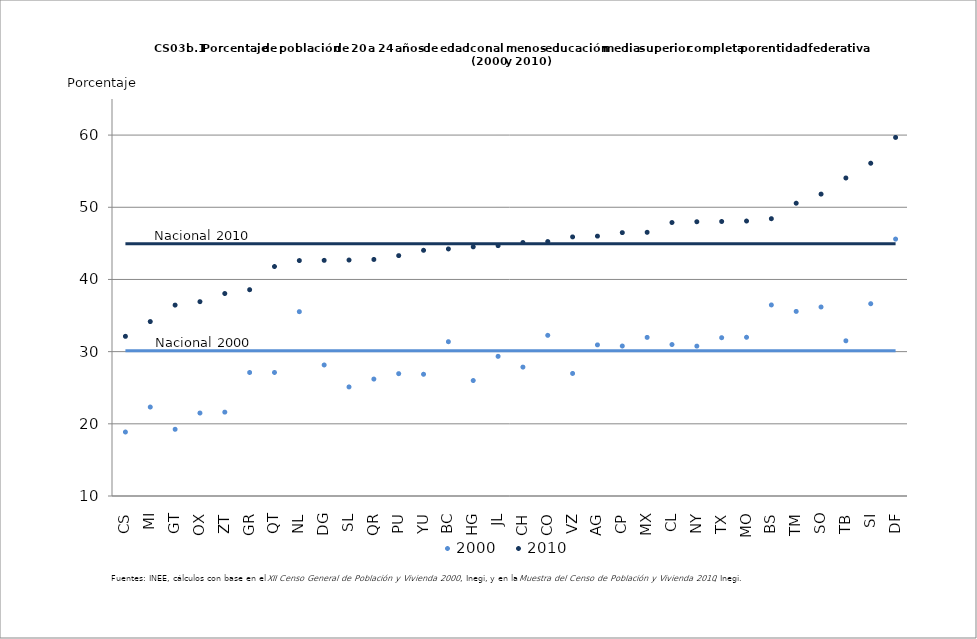
| Category | 2000 | 2010 | nal2000 | nal2010 |
|---|---|---|---|---|
| CS | 18.865 | 32.12 | 30.108 | 44.942 |
| MI | 22.324 | 34.166 | 30.108 | 44.942 |
| GT | 19.243 | 36.45 | 30.108 | 44.942 |
| OX | 21.495 | 36.919 | 30.108 | 44.942 |
| ZT | 21.619 | 38.048 | 30.108 | 44.942 |
| GR | 27.109 | 38.581 | 30.108 | 44.942 |
| QT | 27.115 | 41.792 | 30.108 | 44.942 |
| NL | 35.536 | 42.618 | 30.108 | 44.942 |
| DG | 28.153 | 42.646 | 30.108 | 44.942 |
| SL | 25.109 | 42.691 | 30.108 | 44.942 |
| QR | 26.199 | 42.769 | 30.108 | 44.942 |
| PU | 26.946 | 43.302 | 30.108 | 44.942 |
| YU | 26.865 | 44.038 | 30.108 | 44.942 |
| BC | 31.378 | 44.227 | 30.108 | 44.942 |
| HG | 25.995 | 44.518 | 30.108 | 44.942 |
| JL | 29.349 | 44.682 | 30.108 | 44.942 |
| CH | 27.858 | 45.116 | 30.108 | 44.942 |
| CO | 32.258 | 45.25 | 30.108 | 44.942 |
| VZ | 26.98 | 45.894 | 30.108 | 44.942 |
| AG | 30.938 | 46.002 | 30.108 | 44.942 |
| CP | 30.779 | 46.489 | 30.108 | 44.942 |
| MX | 31.973 | 46.533 | 30.108 | 44.942 |
| CL | 30.986 | 47.89 | 30.108 | 44.942 |
| NY | 30.763 | 47.996 | 30.108 | 44.942 |
| TX | 31.931 | 48.031 | 30.108 | 44.942 |
| MO | 31.992 | 48.096 | 30.108 | 44.942 |
| BS | 36.466 | 48.418 | 30.108 | 44.942 |
| TM | 35.574 | 50.562 | 30.108 | 44.942 |
| SO | 36.185 | 51.824 | 30.108 | 44.942 |
| TB | 31.504 | 54.058 | 30.108 | 44.942 |
| SI | 36.639 | 56.101 | 30.108 | 44.942 |
| DF | 45.597 | 59.677 | 30.108 | 44.942 |